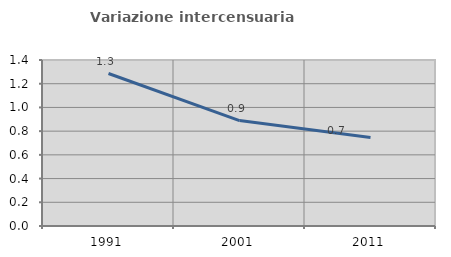
| Category | Variazione intercensuaria annua |
|---|---|
| 1991.0 | 1.286 |
| 2001.0 | 0.889 |
| 2011.0 | 0.747 |